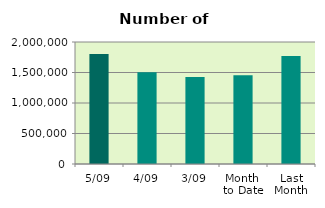
| Category | Series 0 |
|---|---|
| 5/09 | 1801850 |
| 4/09 | 1504036 |
| 3/09 | 1425074 |
| Month 
to Date | 1455523.5 |
| Last
Month | 1768562.909 |